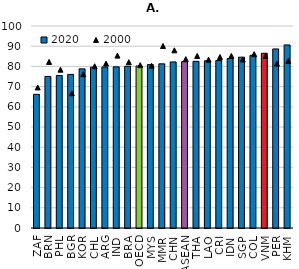
| Category | 2020 |
|---|---|
| ZAF | 66.161 |
| BRN | 75.038 |
| PHL | 75.509 |
| BGR | 76.04 |
| KOR | 78.776 |
| CHL | 79.616 |
| ARG | 79.693 |
| IND | 79.795 |
| BRA | 80.062 |
| OECD | 80.214 |
| MYS | 80.89 |
| MMR | 81.269 |
| CHN | 82.223 |
| ASEAN | 82.357 |
| THA | 82.506 |
| LAO | 82.756 |
| CRI | 82.89 |
| IDN | 83.88 |
| SGP | 84.574 |
| COL | 85.467 |
| VNM | 86.509 |
| PER | 88.646 |
| KHM | 90.637 |